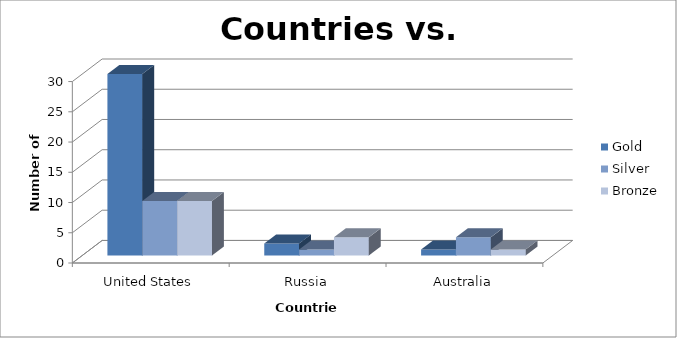
| Category | Gold | Silver | Bronze |
|---|---|---|---|
| United States | 30 | 9 | 9 |
| Russia | 2 | 1 | 3 |
| Australia | 1 | 3 | 1 |